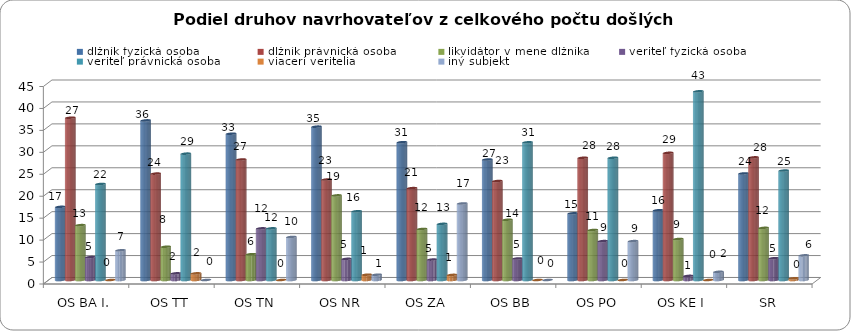
| Category | dlžník fyzická osoba | dlžník právnická osoba | likvidátor v mene dlžníka | veriteľ fyzická osoba | veriteľ právnická osoba | viacerí veritelia | iný subjekt  |
|---|---|---|---|---|---|---|---|
| OS BA I. | 16.667 | 36.979 | 12.5 | 5.208 | 21.875 | 0 | 6.771 |
| OS TT | 36.364 | 24.242 | 7.576 | 1.515 | 28.788 | 1.515 | 0 |
| OS TN | 33.333 | 27.451 | 5.882 | 11.765 | 11.765 | 0 | 9.804 |
| OS NR | 34.94 | 22.892 | 19.277 | 4.819 | 15.663 | 1.205 | 1.205 |
| OS ZA | 31.395 | 20.93 | 11.628 | 4.651 | 12.791 | 1.163 | 17.442 |
| OS BB | 27.451 | 22.549 | 13.725 | 4.902 | 31.373 | 0 | 0 |
| OS PO | 15.19 | 27.848 | 11.392 | 8.861 | 27.848 | 0 | 8.861 |
| OS KE I | 15.888 | 28.972 | 9.346 | 0.935 | 42.991 | 0 | 1.869 |
| SR | 24.282 | 27.937 | 11.88 | 4.961 | 24.935 | 0.392 | 5.614 |